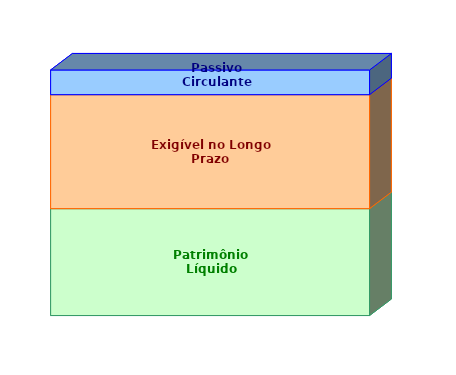
| Category | Patrimônio Líquido | Exigível no Longo Prazo | Passivo Circulante |
|---|---|---|---|
| 0 | 0.435 | 0.464 | 0.1 |